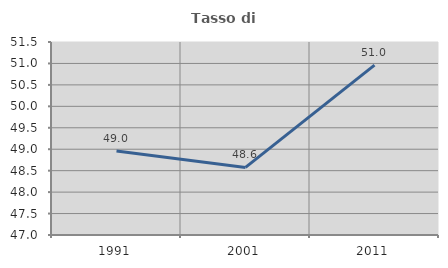
| Category | Tasso di occupazione   |
|---|---|
| 1991.0 | 48.959 |
| 2001.0 | 48.576 |
| 2011.0 | 50.962 |